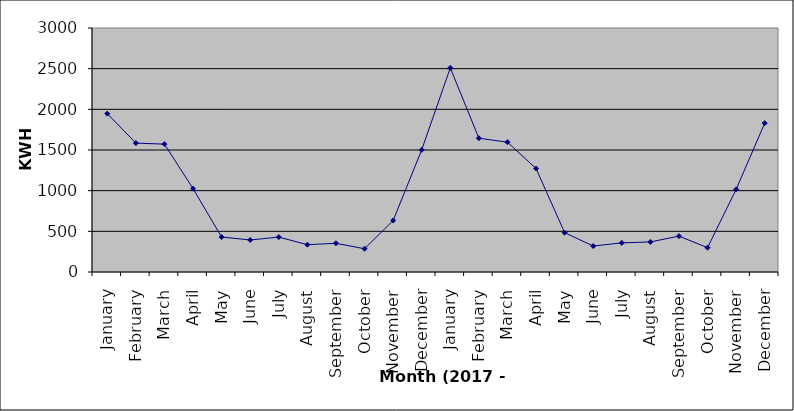
| Category | Series 0 |
|---|---|
| January | 1947 |
| February | 1585 |
| March | 1572 |
| April | 1025 |
| May | 430 |
| June | 394 |
| July | 429 |
| August | 336 |
| September | 353 |
| October | 286 |
| November | 633 |
| December | 1502 |
| January | 2509 |
| February | 1645 |
| March | 1596 |
| April | 1273 |
| May | 484 |
| June | 319 |
| July | 358 |
| August | 370 |
| September | 441 |
| October | 299 |
| November | 1016 |
| December | 1830 |